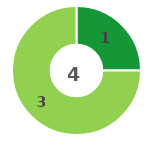
| Category | Series 0 |
|---|---|
| 0 | 1 |
| 1 | 3 |
| 2 | 0 |
| 3 | 0 |
| 4 | 0 |